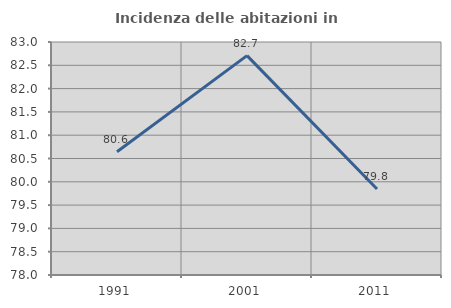
| Category | Incidenza delle abitazioni in proprietà  |
|---|---|
| 1991.0 | 80.643 |
| 2001.0 | 82.709 |
| 2011.0 | 79.845 |